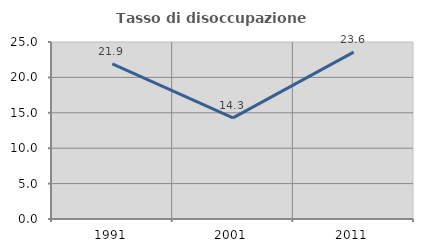
| Category | Tasso di disoccupazione giovanile  |
|---|---|
| 1991.0 | 21.896 |
| 2001.0 | 14.286 |
| 2011.0 | 23.573 |